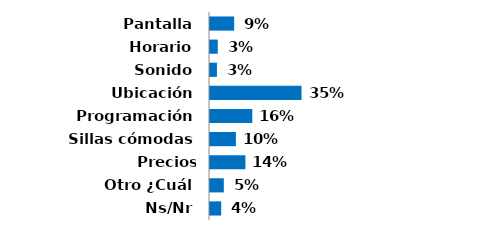
| Category | Series 0 |
|---|---|
| Pantalla | 0.093 |
| Horario | 0.03 |
| Sonido | 0.027 |
| Ubicación | 0.353 |
| Programación | 0.163 |
| Sillas cómodas | 0.1 |
| Precios cómodos | 0.137 |
| Otro ¿Cuál | 0.053 |
| Ns/Nr | 0.043 |